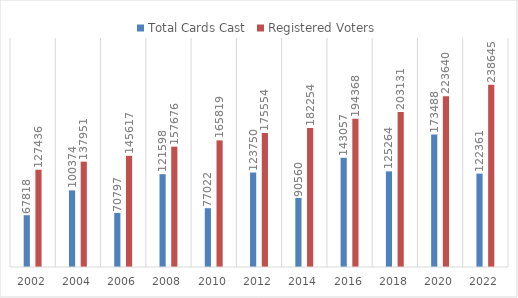
| Category | Total Cards Cast | Registered Voters |
|---|---|---|
| 2002.0 | 67818 | 127436 |
| 2004.0 | 100374 | 137951 |
| 2006.0 | 70797 | 145617 |
| 2008.0 | 121598 | 157676 |
| 2010.0 | 77022 | 165819 |
| 2012.0 | 123750 | 175554 |
| 2014.0 | 90560 | 182254 |
| 2016.0 | 143057 | 194368 |
| 2018.0 | 125264 | 203131 |
| 2020.0 | 173488 | 223640 |
| 2022.0 | 122361 | 238645 |